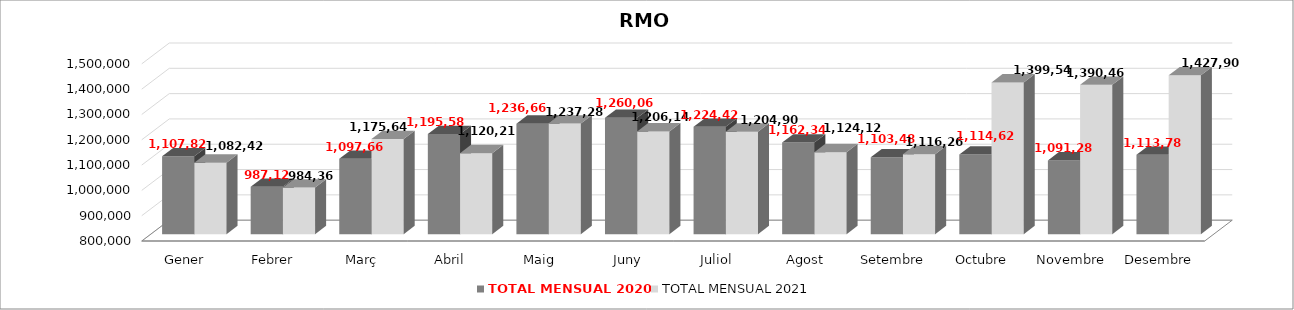
| Category | TOTAL MENSUAL 2020 | TOTAL MENSUAL 2021 |
|---|---|---|
| Gener | 1107820 | 1082420 |
| Febrer | 987120 | 984360.01 |
| Març | 1097660 | 1175640 |
| Abril | 1195580 | 1120218 |
| Maig | 1236660 | 1237280 |
| Juny | 1260060.1 | 1206140 |
| Juliol | 1224420 | 1204900 |
| Agost | 1162340 | 1124120 |
| Setembre | 1103480 | 1116260 |
| Octubre | 1114620 | 1399540 |
| Novembre | 1091280 | 1390460 |
| Desembre | 1113780 | 1427900 |